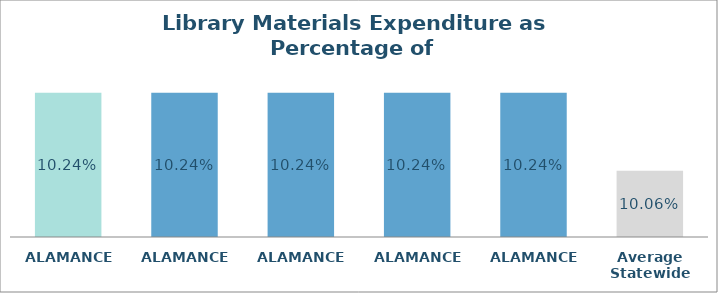
| Category | Series 0 |
|---|---|
| ALAMANCE  | 0.102 |
| ALAMANCE  | 0.102 |
| ALAMANCE  | 0.102 |
| ALAMANCE  | 0.102 |
| ALAMANCE  | 0.102 |
| Average Statewide | 0.101 |